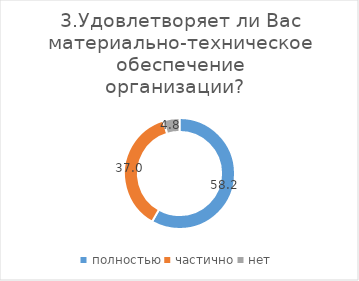
| Category | Series 0 |
|---|---|
| полностью | 58.246 |
| частично | 36.992 |
| нет | 4.762 |